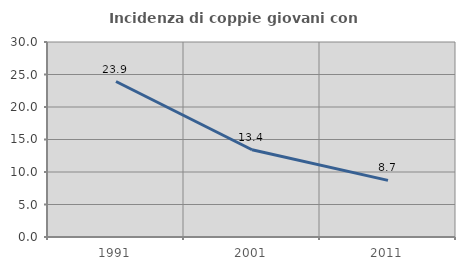
| Category | Incidenza di coppie giovani con figli |
|---|---|
| 1991.0 | 23.923 |
| 2001.0 | 13.424 |
| 2011.0 | 8.717 |